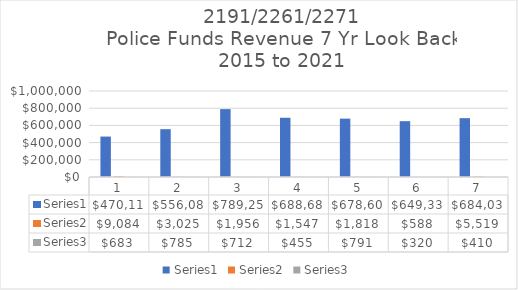
| Category | Series 0 | Series 1 | Series 2 |
|---|---|---|---|
| 0 | 470111 | 9084 | 683 |
| 1 | 556086 | 3025 | 785 |
| 2 | 789255 | 1956 | 712 |
| 3 | 688681 | 1547 | 455 |
| 4 | 678603 | 1818 | 791 |
| 5 | 649332 | 588 | 320 |
| 6 | 684032 | 5519 | 410 |